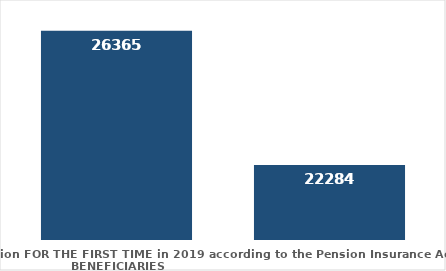
| Category | broj korisnika |
|---|---|
| Pension beneficiaries entitled to pension FOR THE FIRST TIME in 2019 according to the Pension Insurance Act  - NEW BENEFICIARIES | 26365 |
| Pension beneficiaries whose pension entitlement ceased in 2019  -  death caused,   
and who were retired according to the Pension Insurance Act   | 22284 |